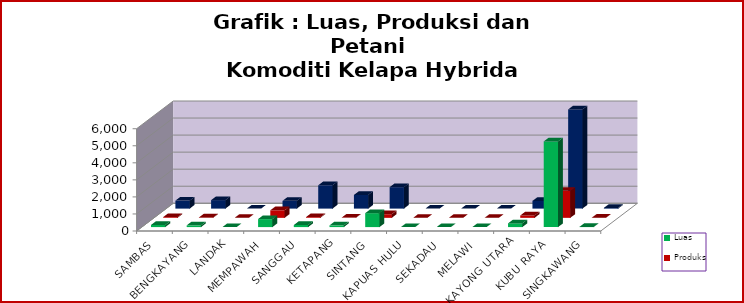
| Category | Luas | Produksi | Petani |
|---|---|---|---|
| SAMBAS | 123 | 44 | 469 |
| BENGKAYANG | 102 | 22 | 497 |
| LANDAK | 0 | 0 | 0 |
| MEMPAWAH | 469 | 442 | 455 |
| SANGGAU | 121 | 44 | 1369 |
| KETAPANG | 101 | 16 | 801 |
| SINTANG | 817 | 211 | 1257 |
| KAPUAS HULU | 0 | 0 | 0 |
| SEKADAU | 0 | 0 | 0 |
| MELAWI | 0 | 0 | 0 |
| KAYONG UTARA | 217 | 138 | 451 |
| KUBU RAYA | 5027 | 1584 | 5818 |
| SINGKAWANG | 11 | 5 | 42 |